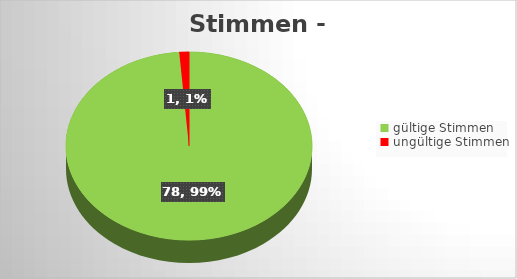
| Category | Series 0 |
|---|---|
| gültige Stimmen | 78 |
| ungültige Stimmen | 1 |